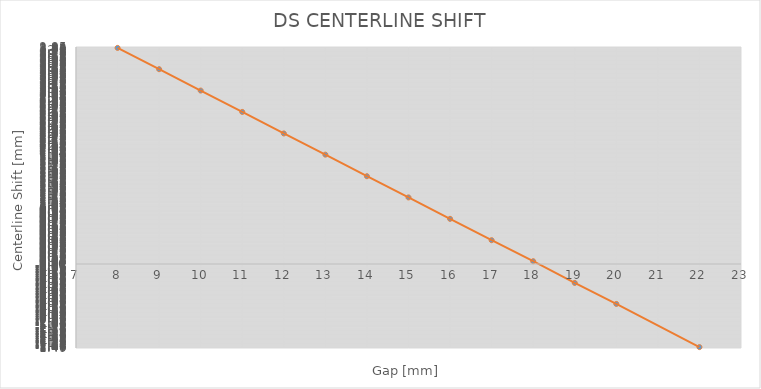
| Category | disabled |
|---|---|
| 8.0 | 3.834 |
| 9.0 | 3.456 |
| 10.0 | 3.077 |
| 11.0 | 2.698 |
| 12.0 | 2.316 |
| 13.0 | 1.94 |
| 14.0 | 1.557 |
| 15.0 | 1.181 |
| 16.0 | 0.802 |
| 17.0 | 0.423 |
| 18.0 | 0.05 |
| 19.0 | -0.335 |
| 20.0 | -0.708 |
| 22.0 | -1.474 |